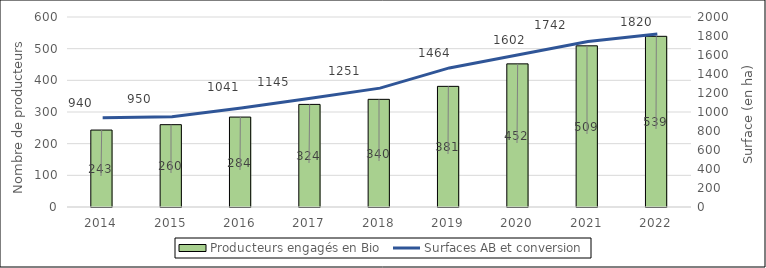
| Category | Producteurs engagés en Bio  |
|---|---|
| 2014.0 | 243 |
| 2015.0 | 260 |
| 2016.0 | 284 |
| 2017.0 | 324 |
| 2018.0 | 340 |
| 2019.0 | 381 |
| 2020.0 | 452 |
| 2021.0 | 509 |
| 2022.0 | 539 |